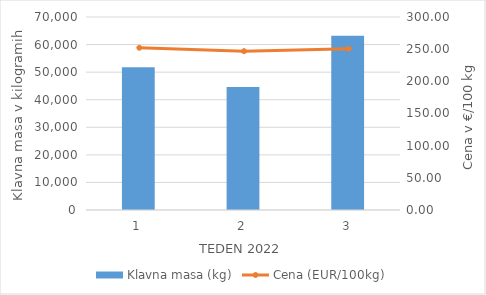
| Category | Klavna masa (kg) |
|---|---|
| 1.0 | 51818 |
| 2.0 | 44619 |
| 3.0 | 63233 |